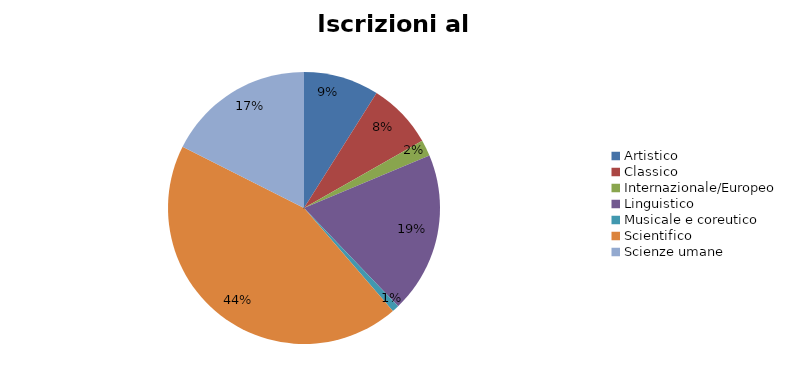
| Category | Series 0 | Series 1 |
|---|---|---|
| Artistico | 1598 |  |
| Classico | 1394 |  |
| Internazionale/Europeo | 341 |  |
| Linguistico | 3416 |  |
| Musicale e coreutico | 149 |  |
| Scientifico | 7808 |  |
| Scienze umane | 3133 |  |